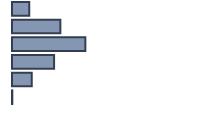
| Category | Series 0 |
|---|---|
| 0 | 8.537 |
| 1 | 24.058 |
| 2 | 36.49 |
| 3 | 20.938 |
| 4 | 9.824 |
| 5 | 0.154 |